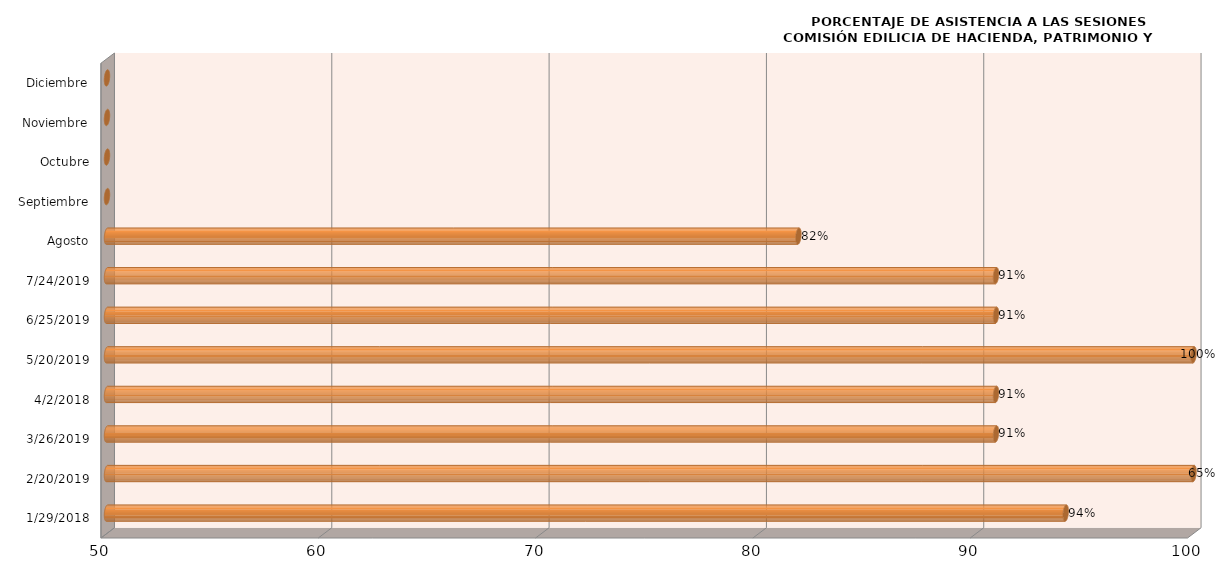
| Category | Series 0 |
|---|---|
| 29/01/2018 | 94.118 |
| 20/02/2019 | 100 |
| 26/03/2019 | 90.909 |
| 02/04/2018 | 90.909 |
| 20/05/2019 | 100 |
| 25/06/2019 | 90.909 |
| 24/07/2019 | 90.909 |
| Agosto | 81.818 |
| Septiembre | 0 |
| Octubre | 0 |
| Noviembre | 0 |
| Diciembre | 0 |